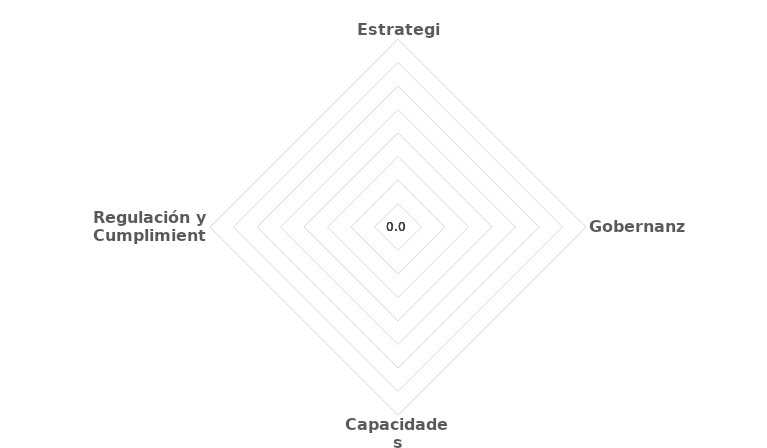
| Category | Series 0 |
|---|---|
| Estrategia | 0 |
| Gobernanza | 0 |
| Capacidades Tecnológicas | 0 |
| Regulación y Cumplimiento | 0 |